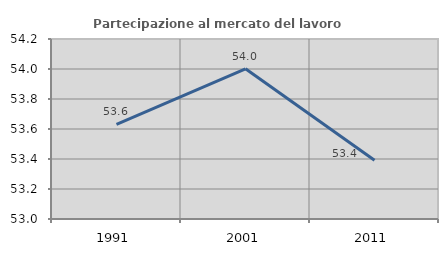
| Category | Partecipazione al mercato del lavoro  femminile |
|---|---|
| 1991.0 | 53.63 |
| 2001.0 | 54.001 |
| 2011.0 | 53.391 |